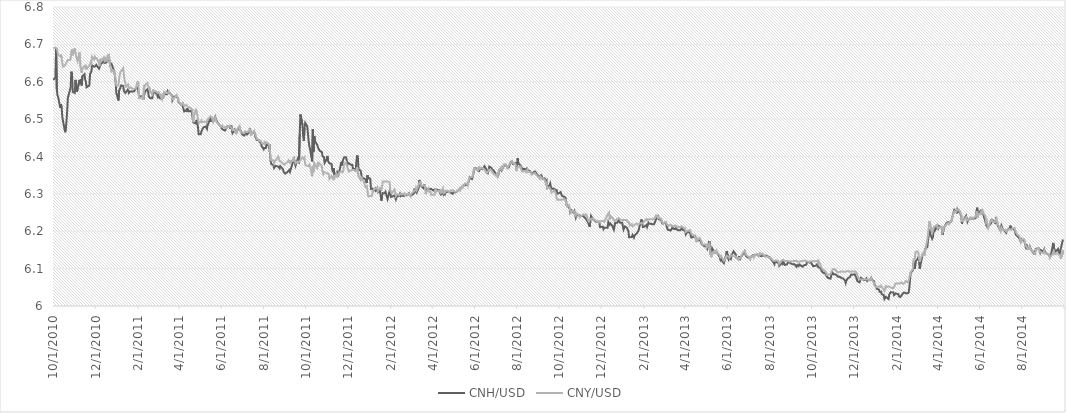
| Category | CNH/USD | CNY/USD |
|---|---|---|
| 10/1/10 | 6.605 | 6.69 |
| 10/4/10 | 6.612 | 6.691 |
| 10/5/10 | 6.691 | 6.691 |
| 10/6/10 | 6.58 | 6.689 |
| 10/7/10 | 6.563 | 6.69 |
| 10/8/10 | 6.559 | 6.671 |
| 10/11/10 | 6.53 | 6.668 |
| 10/12/10 | 6.54 | 6.673 |
| 10/13/10 | 6.53 | 6.663 |
| 10/14/10 | 6.506 | 6.65 |
| 10/15/10 | 6.495 | 6.64 |
| 10/18/10 | 6.465 | 6.644 |
| 10/19/10 | 6.473 | 6.644 |
| 10/20/10 | 6.495 | 6.652 |
| 10/21/10 | 6.522 | 6.65 |
| 10/22/10 | 6.557 | 6.658 |
| 10/25/10 | 6.578 | 6.658 |
| 10/26/10 | 6.585 | 6.662 |
| 10/27/10 | 6.627 | 6.68 |
| 10/28/10 | 6.622 | 6.687 |
| 10/29/10 | 6.573 | 6.671 |
| 11/1/10 | 6.57 | 6.689 |
| 11/2/10 | 6.605 | 6.678 |
| 11/3/10 | 6.584 | 6.676 |
| 11/4/10 | 6.573 | 6.661 |
| 11/5/10 | 6.575 | 6.655 |
| 11/8/10 | 6.605 | 6.679 |
| 11/9/10 | 6.595 | 6.642 |
| 11/10/10 | 6.607 | 6.634 |
| 11/11/10 | 6.59 | 6.624 |
| 11/12/10 | 6.615 | 6.637 |
| 11/15/10 | 6.62 | 6.642 |
| 11/16/10 | 6.605 | 6.638 |
| 11/17/10 | 6.6 | 6.642 |
| 11/18/10 | 6.585 | 6.633 |
| 11/19/10 | 6.585 | 6.64 |
| 11/22/10 | 6.59 | 6.641 |
| 11/23/10 | 6.62 | 6.643 |
| 11/24/10 | 6.62 | 6.653 |
| 11/25/10 | 6.628 | 6.65 |
| 11/26/10 | 6.644 | 6.668 |
| 11/29/10 | 6.64 | 6.66 |
| 11/30/10 | 6.642 | 6.667 |
| 12/1/10 | 6.642 | 6.663 |
| 12/2/10 | 6.645 | 6.661 |
| 12/3/10 | 6.642 | 6.663 |
| 12/6/10 | 6.635 | 6.648 |
| 12/7/10 | 6.635 | 6.646 |
| 12/8/10 | 6.645 | 6.662 |
| 12/9/10 | 6.648 | 6.655 |
| 12/10/10 | 6.647 | 6.655 |
| 12/13/10 | 6.655 | 6.665 |
| 12/14/10 | 6.65 | 6.656 |
| 12/15/10 | 6.652 | 6.654 |
| 12/16/10 | 6.651 | 6.664 |
| 12/17/10 | 6.65 | 6.654 |
| 12/20/10 | 6.661 | 6.674 |
| 12/21/10 | 6.658 | 6.658 |
| 12/22/10 | 6.645 | 6.645 |
| 12/23/10 | 6.645 | 6.645 |
| 12/24/10 | 6.648 | 6.627 |
| 12/27/10 | 6.633 | 6.631 |
| 12/28/10 | 6.628 | 6.625 |
| 12/29/10 | 6.615 | 6.62 |
| 12/30/10 | 6.6 | 6.6 |
| 12/31/10 | 6.57 | 6.59 |
| 1/3/11 | 6.55 | 6.59 |
| 1/4/11 | 6.576 | 6.606 |
| 1/5/11 | 6.58 | 6.619 |
| 1/6/11 | 6.582 | 6.626 |
| 1/7/11 | 6.59 | 6.628 |
| 1/10/11 | 6.588 | 6.636 |
| 1/11/11 | 6.576 | 6.618 |
| 1/12/11 | 6.573 | 6.604 |
| 1/13/11 | 6.57 | 6.604 |
| 1/14/11 | 6.571 | 6.588 |
| 1/17/11 | 6.58 | 6.593 |
| 1/18/11 | 6.57 | 6.583 |
| 1/19/11 | 6.572 | 6.582 |
| 1/20/11 | 6.574 | 6.585 |
| 1/21/11 | 6.572 | 6.583 |
| 1/24/11 | 6.574 | 6.581 |
| 1/25/11 | 6.575 | 6.582 |
| 1/26/11 | 6.575 | 6.581 |
| 1/27/11 | 6.575 | 6.582 |
| 1/28/11 | 6.582 | 6.582 |
| 1/31/11 | 6.584 | 6.602 |
| 2/1/11 | 6.571 | 6.594 |
| 2/2/11 | 6.562 | 6.556 |
| 2/3/11 | 6.562 | 6.556 |
| 2/4/11 | 6.562 | 6.556 |
| 2/7/11 | 6.56 | 6.56 |
| 2/8/11 | 6.552 | 6.552 |
| 2/9/11 | 6.564 | 6.591 |
| 2/10/11 | 6.564 | 6.586 |
| 2/11/11 | 6.575 | 6.592 |
| 2/14/11 | 6.58 | 6.596 |
| 2/15/11 | 6.572 | 6.588 |
| 2/16/11 | 6.56 | 6.588 |
| 2/17/11 | 6.562 | 6.585 |
| 2/18/11 | 6.556 | 6.573 |
| 2/21/11 | 6.556 | 6.567 |
| 2/22/11 | 6.569 | 6.58 |
| 2/23/11 | 6.567 | 6.574 |
| 2/24/11 | 6.573 | 6.572 |
| 2/25/11 | 6.573 | 6.575 |
| 2/28/11 | 6.566 | 6.571 |
| 3/1/11 | 6.56 | 6.57 |
| 3/2/11 | 6.563 | 6.572 |
| 3/3/11 | 6.562 | 6.572 |
| 3/4/11 | 6.556 | 6.567 |
| 3/7/11 | 6.554 | 6.554 |
| 3/8/11 | 6.554 | 6.568 |
| 3/9/11 | 6.559 | 6.558 |
| 3/10/11 | 6.567 | 6.573 |
| 3/11/11 | 6.568 | 6.574 |
| 3/14/11 | 6.566 | 6.57 |
| 3/15/11 | 6.574 | 6.572 |
| 3/16/11 | 6.57 | 6.571 |
| 3/17/11 | 6.571 | 6.574 |
| 3/18/11 | 6.57 | 6.569 |
| 3/21/11 | 6.564 | 6.564 |
| 3/22/11 | 6.551 | 6.551 |
| 3/23/11 | 6.55 | 6.558 |
| 3/24/11 | 6.56 | 6.558 |
| 3/25/11 | 6.558 | 6.557 |
| 3/28/11 | 6.561 | 6.564 |
| 3/29/11 | 6.562 | 6.561 |
| 3/30/11 | 6.556 | 6.556 |
| 3/31/11 | 6.546 | 6.548 |
| 4/1/11 | 6.546 | 6.548 |
| 4/4/11 | 6.538 | 6.538 |
| 4/5/11 | 6.539 | 6.539 |
| 4/6/11 | 6.536 | 6.544 |
| 4/7/11 | 6.536 | 6.542 |
| 4/8/11 | 6.52 | 6.535 |
| 4/11/11 | 6.523 | 6.538 |
| 4/12/11 | 6.529 | 6.54 |
| 4/13/11 | 6.519 | 6.533 |
| 4/14/11 | 6.524 | 6.531 |
| 4/15/11 | 6.521 | 6.532 |
| 4/18/11 | 6.522 | 6.529 |
| 4/19/11 | 6.519 | 6.53 |
| 4/20/11 | 6.507 | 6.525 |
| 4/21/11 | 6.492 | 6.492 |
| 4/22/11 | 6.492 | 6.507 |
| 4/25/11 | 6.488 | 6.528 |
| 4/26/11 | 6.498 | 6.527 |
| 4/27/11 | 6.491 | 6.511 |
| 4/28/11 | 6.478 | 6.501 |
| 4/29/11 | 6.46 | 6.49 |
| 5/2/11 | 6.46 | 6.492 |
| 5/3/11 | 6.467 | 6.496 |
| 5/4/11 | 6.468 | 6.492 |
| 5/5/11 | 6.475 | 6.493 |
| 5/6/11 | 6.478 | 6.492 |
| 5/9/11 | 6.48 | 6.493 |
| 5/10/11 | 6.477 | 6.492 |
| 5/11/11 | 6.474 | 6.492 |
| 5/12/11 | 6.492 | 6.499 |
| 5/13/11 | 6.488 | 6.498 |
| 5/16/11 | 6.504 | 6.508 |
| 5/17/11 | 6.493 | 6.506 |
| 5/18/11 | 6.498 | 6.505 |
| 5/19/11 | 6.496 | 6.504 |
| 5/20/11 | 6.493 | 6.492 |
| 5/23/11 | 6.506 | 6.504 |
| 5/24/11 | 6.499 | 6.498 |
| 5/25/11 | 6.497 | 6.493 |
| 5/26/11 | 6.492 | 6.49 |
| 5/27/11 | 6.489 | 6.492 |
| 5/30/11 | 6.482 | 6.483 |
| 5/31/11 | 6.48 | 6.479 |
| 6/1/11 | 6.476 | 6.478 |
| 6/2/11 | 6.478 | 6.483 |
| 6/3/11 | 6.472 | 6.478 |
| 6/6/11 | 6.47 | 6.478 |
| 6/7/11 | 6.47 | 6.481 |
| 6/8/11 | 6.475 | 6.475 |
| 6/9/11 | 6.48 | 6.476 |
| 6/10/11 | 6.479 | 6.48 |
| 6/13/11 | 6.482 | 6.483 |
| 6/14/11 | 6.474 | 6.479 |
| 6/15/11 | 6.482 | 6.481 |
| 6/16/11 | 6.481 | 6.475 |
| 6/17/11 | 6.463 | 6.47 |
| 6/20/11 | 6.472 | 6.472 |
| 6/21/11 | 6.468 | 6.465 |
| 6/22/11 | 6.461 | 6.462 |
| 6/23/11 | 6.468 | 6.468 |
| 6/24/11 | 6.471 | 6.474 |
| 6/27/11 | 6.478 | 6.482 |
| 6/28/11 | 6.475 | 6.469 |
| 6/29/11 | 6.467 | 6.463 |
| 6/30/11 | 6.462 | 6.464 |
| 7/1/11 | 6.459 | 6.464 |
| 7/4/11 | 6.456 | 6.463 |
| 7/5/11 | 6.46 | 6.467 |
| 7/6/11 | 6.464 | 6.467 |
| 7/7/11 | 6.464 | 6.466 |
| 7/8/11 | 6.459 | 6.464 |
| 7/11/11 | 6.465 | 6.467 |
| 7/12/11 | 6.475 | 6.472 |
| 7/13/11 | 6.464 | 6.468 |
| 7/14/11 | 6.46 | 6.459 |
| 7/15/11 | 6.46 | 6.461 |
| 7/18/11 | 6.467 | 6.469 |
| 7/19/11 | 6.462 | 6.463 |
| 7/20/11 | 6.453 | 6.458 |
| 7/21/11 | 6.454 | 6.454 |
| 7/22/11 | 6.444 | 6.447 |
| 7/25/11 | 6.444 | 6.444 |
| 7/26/11 | 6.438 | 6.441 |
| 7/27/11 | 6.437 | 6.443 |
| 7/28/11 | 6.436 | 6.442 |
| 7/29/11 | 6.428 | 6.436 |
| 8/1/11 | 6.419 | 6.434 |
| 8/2/11 | 6.423 | 6.438 |
| 8/3/11 | 6.422 | 6.434 |
| 8/4/11 | 6.423 | 6.438 |
| 8/5/11 | 6.435 | 6.44 |
| 8/8/11 | 6.428 | 6.434 |
| 8/9/11 | 6.433 | 6.43 |
| 8/10/11 | 6.41 | 6.417 |
| 8/11/11 | 6.388 | 6.394 |
| 8/12/11 | 6.38 | 6.389 |
| 8/15/11 | 6.377 | 6.39 |
| 8/16/11 | 6.37 | 6.382 |
| 8/17/11 | 6.368 | 6.387 |
| 8/18/11 | 6.375 | 6.388 |
| 8/19/11 | 6.375 | 6.391 |
| 8/22/11 | 6.373 | 6.4 |
| 8/23/11 | 6.372 | 6.398 |
| 8/24/11 | 6.368 | 6.388 |
| 8/25/11 | 6.374 | 6.39 |
| 8/26/11 | 6.372 | 6.387 |
| 8/29/11 | 6.366 | 6.381 |
| 8/30/11 | 6.358 | 6.38 |
| 8/31/11 | 6.356 | 6.378 |
| 9/1/11 | 6.354 | 6.381 |
| 9/2/11 | 6.354 | 6.382 |
| 9/5/11 | 6.36 | 6.386 |
| 9/6/11 | 6.36 | 6.39 |
| 9/7/11 | 6.364 | 6.392 |
| 9/8/11 | 6.359 | 6.383 |
| 9/9/11 | 6.361 | 6.388 |
| 9/12/11 | 6.384 | 6.388 |
| 9/13/11 | 6.385 | 6.398 |
| 9/14/11 | 6.393 | 6.391 |
| 9/15/11 | 6.383 | 6.388 |
| 9/16/11 | 6.376 | 6.382 |
| 9/19/11 | 6.392 | 6.386 |
| 9/20/11 | 6.386 | 6.384 |
| 9/21/11 | 6.381 | 6.381 |
| 9/22/11 | 6.46 | 6.388 |
| 9/23/11 | 6.512 | 6.387 |
| 9/26/11 | 6.485 | 6.398 |
| 9/27/11 | 6.455 | 6.398 |
| 9/28/11 | 6.442 | 6.393 |
| 9/29/11 | 6.478 | 6.396 |
| 9/30/11 | 6.49 | 6.378 |
| 10/3/11 | 6.48 | 6.374 |
| 10/4/11 | 6.48 | 6.374 |
| 10/5/11 | 6.44 | 6.374 |
| 10/6/11 | 6.427 | 6.378 |
| 10/7/11 | 6.42 | 6.374 |
| 10/10/11 | 6.387 | 6.347 |
| 10/11/11 | 6.473 | 6.374 |
| 10/12/11 | 6.413 | 6.358 |
| 10/13/11 | 6.455 | 6.382 |
| 10/14/11 | 6.442 | 6.378 |
| 10/17/11 | 6.432 | 6.369 |
| 10/18/11 | 6.43 | 6.38 |
| 10/19/11 | 6.422 | 6.377 |
| 10/20/11 | 6.42 | 6.382 |
| 10/21/11 | 6.415 | 6.382 |
| 10/24/11 | 6.412 | 6.374 |
| 10/25/11 | 6.401 | 6.36 |
| 10/26/11 | 6.402 | 6.353 |
| 10/27/11 | 6.398 | 6.359 |
| 10/28/11 | 6.383 | 6.357 |
| 10/31/11 | 6.393 | 6.355 |
| 11/1/11 | 6.402 | 6.354 |
| 11/2/11 | 6.388 | 6.355 |
| 11/3/11 | 6.39 | 6.351 |
| 11/4/11 | 6.382 | 6.34 |
| 11/7/11 | 6.38 | 6.348 |
| 11/8/11 | 6.366 | 6.346 |
| 11/9/11 | 6.358 | 6.34 |
| 11/10/11 | 6.369 | 6.345 |
| 11/11/11 | 6.352 | 6.342 |
| 11/14/11 | 6.356 | 6.354 |
| 11/15/11 | 6.359 | 6.346 |
| 11/16/11 | 6.358 | 6.344 |
| 11/17/11 | 6.351 | 6.35 |
| 11/18/11 | 6.357 | 6.356 |
| 11/21/11 | 6.385 | 6.36 |
| 11/22/11 | 6.376 | 6.36 |
| 11/23/11 | 6.387 | 6.358 |
| 11/24/11 | 6.388 | 6.362 |
| 11/25/11 | 6.398 | 6.38 |
| 11/28/11 | 6.398 | 6.384 |
| 11/29/11 | 6.39 | 6.377 |
| 11/30/11 | 6.379 | 6.378 |
| 12/1/11 | 6.383 | 6.366 |
| 12/2/11 | 6.384 | 6.36 |
| 12/5/11 | 6.378 | 6.363 |
| 12/6/11 | 6.38 | 6.364 |
| 12/7/11 | 6.378 | 6.364 |
| 12/8/11 | 6.368 | 6.362 |
| 12/9/11 | 6.368 | 6.364 |
| 12/12/11 | 6.366 | 6.36 |
| 12/13/11 | 6.388 | 6.365 |
| 12/14/11 | 6.403 | 6.371 |
| 12/15/11 | 6.398 | 6.373 |
| 12/16/11 | 6.366 | 6.348 |
| 12/19/11 | 6.362 | 6.338 |
| 12/20/11 | 6.353 | 6.346 |
| 12/21/11 | 6.342 | 6.339 |
| 12/22/11 | 6.345 | 6.339 |
| 12/23/11 | 6.342 | 6.336 |
| 12/26/11 | 6.339 | 6.319 |
| 12/27/11 | 6.334 | 6.321 |
| 12/28/11 | 6.329 | 6.321 |
| 12/29/11 | 6.35 | 6.319 |
| 12/30/11 | 6.343 | 6.294 |
| 1/2/12 | 6.341 | 6.294 |
| 1/3/12 | 6.314 | 6.294 |
| 1/4/12 | 6.313 | 6.294 |
| 1/5/12 | 6.314 | 6.301 |
| 1/6/12 | 6.307 | 6.309 |
| 1/9/12 | 6.314 | 6.314 |
| 1/10/12 | 6.308 | 6.314 |
| 1/11/12 | 6.31 | 6.315 |
| 1/12/12 | 6.312 | 6.318 |
| 1/13/12 | 6.304 | 6.306 |
| 1/16/12 | 6.308 | 6.316 |
| 1/17/12 | 6.296 | 6.314 |
| 1/18/12 | 6.282 | 6.311 |
| 1/19/12 | 6.295 | 6.316 |
| 1/20/12 | 6.302 | 6.333 |
| 1/23/12 | 6.302 | 6.333 |
| 1/24/12 | 6.306 | 6.333 |
| 1/25/12 | 6.305 | 6.333 |
| 1/26/12 | 6.292 | 6.333 |
| 1/27/12 | 6.286 | 6.333 |
| 1/30/12 | 6.308 | 6.331 |
| 1/31/12 | 6.302 | 6.308 |
| 2/1/12 | 6.292 | 6.306 |
| 2/2/12 | 6.294 | 6.302 |
| 2/3/12 | 6.293 | 6.303 |
| 2/6/12 | 6.296 | 6.312 |
| 2/7/12 | 6.292 | 6.305 |
| 2/8/12 | 6.286 | 6.294 |
| 2/9/12 | 6.291 | 6.295 |
| 2/10/12 | 6.294 | 6.299 |
| 2/13/12 | 6.295 | 6.297 |
| 2/14/12 | 6.3 | 6.3 |
| 2/15/12 | 6.295 | 6.3 |
| 2/16/12 | 6.298 | 6.301 |
| 2/17/12 | 6.295 | 6.298 |
| 2/20/12 | 6.294 | 6.301 |
| 2/21/12 | 6.298 | 6.296 |
| 2/22/12 | 6.297 | 6.296 |
| 2/23/12 | 6.296 | 6.298 |
| 2/24/12 | 6.296 | 6.298 |
| 2/27/12 | 6.302 | 6.301 |
| 2/28/12 | 6.296 | 6.299 |
| 2/29/12 | 6.295 | 6.294 |
| 3/1/12 | 6.296 | 6.3 |
| 3/2/12 | 6.296 | 6.298 |
| 3/5/12 | 6.301 | 6.307 |
| 3/6/12 | 6.314 | 6.308 |
| 3/7/12 | 6.308 | 6.31 |
| 3/8/12 | 6.307 | 6.316 |
| 3/9/12 | 6.303 | 6.31 |
| 3/12/12 | 6.316 | 6.326 |
| 3/13/12 | 6.337 | 6.327 |
| 3/14/12 | 6.332 | 6.331 |
| 3/15/12 | 6.327 | 6.328 |
| 3/16/12 | 6.32 | 6.322 |
| 3/19/12 | 6.315 | 6.322 |
| 3/20/12 | 6.325 | 6.324 |
| 3/21/12 | 6.324 | 6.323 |
| 3/22/12 | 6.314 | 6.299 |
| 3/23/12 | 6.31 | 6.304 |
| 3/26/12 | 6.312 | 6.314 |
| 3/27/12 | 6.312 | 6.306 |
| 3/28/12 | 6.313 | 6.304 |
| 3/29/12 | 6.315 | 6.306 |
| 3/30/12 | 6.314 | 6.298 |
| 4/2/12 | 6.309 | 6.298 |
| 4/3/12 | 6.31 | 6.298 |
| 4/4/12 | 6.312 | 6.298 |
| 4/5/12 | 6.314 | 6.312 |
| 4/6/12 | 6.312 | 6.305 |
| 4/9/12 | 6.31 | 6.308 |
| 4/10/12 | 6.309 | 6.31 |
| 4/11/12 | 6.31 | 6.308 |
| 4/12/12 | 6.302 | 6.307 |
| 4/13/12 | 6.298 | 6.302 |
| 4/16/12 | 6.301 | 6.315 |
| 4/17/12 | 6.298 | 6.302 |
| 4/18/12 | 6.304 | 6.303 |
| 4/19/12 | 6.3 | 6.304 |
| 4/20/12 | 6.305 | 6.308 |
| 4/23/12 | 6.306 | 6.308 |
| 4/24/12 | 6.306 | 6.307 |
| 4/25/12 | 6.306 | 6.304 |
| 4/26/12 | 6.303 | 6.305 |
| 4/27/12 | 6.304 | 6.309 |
| 4/30/12 | 6.3 | 6.309 |
| 5/1/12 | 6.298 | 6.309 |
| 5/2/12 | 6.305 | 6.307 |
| 5/3/12 | 6.304 | 6.305 |
| 5/4/12 | 6.304 | 6.306 |
| 5/7/12 | 6.308 | 6.307 |
| 5/8/12 | 6.306 | 6.308 |
| 5/9/12 | 6.311 | 6.31 |
| 5/10/12 | 6.312 | 6.314 |
| 5/11/12 | 6.313 | 6.31 |
| 5/14/12 | 6.32 | 6.321 |
| 5/15/12 | 6.318 | 6.318 |
| 5/16/12 | 6.323 | 6.321 |
| 5/17/12 | 6.325 | 6.325 |
| 5/18/12 | 6.323 | 6.328 |
| 5/21/12 | 6.324 | 6.327 |
| 5/22/12 | 6.322 | 6.323 |
| 5/23/12 | 6.332 | 6.334 |
| 5/24/12 | 6.338 | 6.344 |
| 5/25/12 | 6.344 | 6.344 |
| 5/28/12 | 6.34 | 6.345 |
| 5/29/12 | 6.345 | 6.348 |
| 5/30/12 | 6.354 | 6.357 |
| 5/31/12 | 6.366 | 6.368 |
| 6/1/12 | 6.368 | 6.369 |
| 6/4/12 | 6.368 | 6.364 |
| 6/5/12 | 6.366 | 6.367 |
| 6/6/12 | 6.364 | 6.364 |
| 6/7/12 | 6.358 | 6.363 |
| 6/8/12 | 6.37 | 6.37 |
| 6/11/12 | 6.367 | 6.369 |
| 6/12/12 | 6.37 | 6.37 |
| 6/13/12 | 6.368 | 6.368 |
| 6/14/12 | 6.368 | 6.37 |
| 6/15/12 | 6.374 | 6.365 |
| 6/18/12 | 6.365 | 6.357 |
| 6/19/12 | 6.36 | 6.354 |
| 6/20/12 | 6.357 | 6.36 |
| 6/21/12 | 6.364 | 6.364 |
| 6/22/12 | 6.373 | 6.364 |
| 6/25/12 | 6.37 | 6.363 |
| 6/26/12 | 6.365 | 6.363 |
| 6/27/12 | 6.363 | 6.356 |
| 6/28/12 | 6.364 | 6.357 |
| 6/29/12 | 6.365 | 6.353 |
| 7/2/12 | 6.351 | 6.348 |
| 7/3/12 | 6.35 | 6.352 |
| 7/4/12 | 6.346 | 6.348 |
| 7/5/12 | 6.35 | 6.356 |
| 7/6/12 | 6.36 | 6.364 |
| 7/9/12 | 6.369 | 6.371 |
| 7/10/12 | 6.363 | 6.365 |
| 7/11/12 | 6.364 | 6.368 |
| 7/12/12 | 6.371 | 6.373 |
| 7/13/12 | 6.376 | 6.379 |
| 7/16/12 | 6.378 | 6.378 |
| 7/17/12 | 6.374 | 6.372 |
| 7/18/12 | 6.37 | 6.369 |
| 7/19/12 | 6.369 | 6.372 |
| 7/20/12 | 6.37 | 6.373 |
| 7/23/12 | 6.386 | 6.386 |
| 7/24/12 | 6.387 | 6.386 |
| 7/25/12 | 6.387 | 6.388 |
| 7/26/12 | 6.38 | 6.384 |
| 7/27/12 | 6.382 | 6.381 |
| 7/30/12 | 6.382 | 6.379 |
| 7/31/12 | 6.372 | 6.361 |
| 8/1/12 | 6.377 | 6.368 |
| 8/2/12 | 6.396 | 6.367 |
| 8/3/12 | 6.381 | 6.372 |
| 8/6/12 | 6.376 | 6.374 |
| 8/7/12 | 6.376 | 6.366 |
| 8/8/12 | 6.369 | 6.361 |
| 8/9/12 | 6.364 | 6.359 |
| 8/10/12 | 6.367 | 6.36 |
| 8/13/12 | 6.366 | 6.361 |
| 8/14/12 | 6.363 | 6.359 |
| 8/15/12 | 6.367 | 6.362 |
| 8/16/12 | 6.369 | 6.366 |
| 8/17/12 | 6.362 | 6.358 |
| 8/20/12 | 6.361 | 6.359 |
| 8/21/12 | 6.356 | 6.356 |
| 8/22/12 | 6.356 | 6.352 |
| 8/23/12 | 6.354 | 6.354 |
| 8/24/12 | 6.356 | 6.354 |
| 8/27/12 | 6.36 | 6.356 |
| 8/28/12 | 6.358 | 6.352 |
| 8/29/12 | 6.355 | 6.351 |
| 8/30/12 | 6.354 | 6.349 |
| 8/31/12 | 6.35 | 6.348 |
| 9/3/12 | 6.346 | 6.34 |
| 9/4/12 | 6.346 | 6.346 |
| 9/5/12 | 6.35 | 6.349 |
| 9/6/12 | 6.347 | 6.343 |
| 9/7/12 | 6.34 | 6.343 |
| 9/10/12 | 6.342 | 6.338 |
| 9/11/12 | 6.337 | 6.335 |
| 9/12/12 | 6.33 | 6.326 |
| 9/13/12 | 6.334 | 6.329 |
| 9/14/12 | 6.316 | 6.314 |
| 9/17/12 | 6.323 | 6.317 |
| 9/18/12 | 6.328 | 6.319 |
| 9/19/12 | 6.318 | 6.309 |
| 9/20/12 | 6.314 | 6.304 |
| 9/21/12 | 6.312 | 6.305 |
| 9/24/12 | 6.314 | 6.309 |
| 9/25/12 | 6.311 | 6.306 |
| 9/26/12 | 6.304 | 6.302 |
| 9/27/12 | 6.312 | 6.302 |
| 9/28/12 | 6.3 | 6.284 |
| 10/1/12 | 6.302 | 6.284 |
| 10/2/12 | 6.301 | 6.284 |
| 10/3/12 | 6.305 | 6.284 |
| 10/4/12 | 6.303 | 6.284 |
| 10/5/12 | 6.294 | 6.284 |
| 10/8/12 | 6.292 | 6.287 |
| 10/9/12 | 6.292 | 6.288 |
| 10/10/12 | 6.29 | 6.283 |
| 10/11/12 | 6.28 | 6.276 |
| 10/12/12 | 6.268 | 6.267 |
| 10/15/12 | 6.265 | 6.27 |
| 10/16/12 | 6.261 | 6.264 |
| 10/17/12 | 6.25 | 6.254 |
| 10/18/12 | 6.252 | 6.25 |
| 10/19/12 | 6.255 | 6.253 |
| 10/22/12 | 6.249 | 6.254 |
| 10/23/12 | 6.254 | 6.248 |
| 10/24/12 | 6.244 | 6.248 |
| 10/25/12 | 6.236 | 6.242 |
| 10/26/12 | 6.242 | 6.248 |
| 10/29/12 | 6.244 | 6.244 |
| 10/30/12 | 6.242 | 6.24 |
| 10/31/12 | 6.24 | 6.237 |
| 11/1/12 | 6.241 | 6.239 |
| 11/2/12 | 6.24 | 6.241 |
| 11/5/12 | 6.241 | 6.245 |
| 11/6/12 | 6.238 | 6.245 |
| 11/7/12 | 6.236 | 6.244 |
| 11/8/12 | 6.235 | 6.243 |
| 11/9/12 | 6.232 | 6.245 |
| 11/12/12 | 6.223 | 6.229 |
| 11/13/12 | 6.217 | 6.226 |
| 11/14/12 | 6.212 | 6.225 |
| 11/15/12 | 6.228 | 6.233 |
| 11/16/12 | 6.241 | 6.235 |
| 11/19/12 | 6.232 | 6.234 |
| 11/20/12 | 6.234 | 6.232 |
| 11/21/12 | 6.23 | 6.23 |
| 11/22/12 | 6.229 | 6.229 |
| 11/23/12 | 6.226 | 6.228 |
| 11/26/12 | 6.225 | 6.225 |
| 11/27/12 | 6.224 | 6.222 |
| 11/28/12 | 6.224 | 6.227 |
| 11/29/12 | 6.211 | 6.228 |
| 11/30/12 | 6.213 | 6.226 |
| 12/3/12 | 6.212 | 6.228 |
| 12/4/12 | 6.206 | 6.225 |
| 12/5/12 | 6.209 | 6.225 |
| 12/6/12 | 6.212 | 6.228 |
| 12/7/12 | 6.21 | 6.23 |
| 12/10/12 | 6.21 | 6.245 |
| 12/11/12 | 6.225 | 6.246 |
| 12/12/12 | 6.224 | 6.25 |
| 12/13/12 | 6.218 | 6.232 |
| 12/14/12 | 6.22 | 6.241 |
| 12/17/12 | 6.214 | 6.236 |
| 12/18/12 | 6.208 | 6.232 |
| 12/19/12 | 6.204 | 6.229 |
| 12/20/12 | 6.214 | 6.23 |
| 12/21/12 | 6.223 | 6.228 |
| 12/24/12 | 6.223 | 6.234 |
| 12/25/12 | 6.224 | 6.234 |
| 12/26/12 | 6.23 | 6.235 |
| 12/27/12 | 6.227 | 6.236 |
| 12/28/12 | 6.223 | 6.231 |
| 12/31/12 | 6.223 | 6.23 |
| 1/1/13 | 6.223 | 6.23 |
| 1/2/13 | 6.204 | 6.23 |
| 1/3/13 | 6.209 | 6.23 |
| 1/4/13 | 6.213 | 6.23 |
| 1/7/13 | 6.209 | 6.229 |
| 1/8/13 | 6.204 | 6.224 |
| 1/9/13 | 6.2 | 6.226 |
| 1/10/13 | 6.184 | 6.223 |
| 1/11/13 | 6.183 | 6.216 |
| 1/14/13 | 6.184 | 6.219 |
| 1/15/13 | 6.19 | 6.213 |
| 1/16/13 | 6.188 | 6.216 |
| 1/17/13 | 6.183 | 6.216 |
| 1/18/13 | 6.189 | 6.215 |
| 1/21/13 | 6.194 | 6.221 |
| 1/22/13 | 6.197 | 6.22 |
| 1/23/13 | 6.2 | 6.218 |
| 1/24/13 | 6.203 | 6.218 |
| 1/25/13 | 6.213 | 6.22 |
| 1/28/13 | 6.232 | 6.222 |
| 1/29/13 | 6.22 | 6.224 |
| 1/30/13 | 6.212 | 6.22 |
| 1/31/13 | 6.209 | 6.219 |
| 2/1/13 | 6.212 | 6.227 |
| 2/4/13 | 6.216 | 6.233 |
| 2/5/13 | 6.211 | 6.229 |
| 2/6/13 | 6.214 | 6.232 |
| 2/7/13 | 6.223 | 6.232 |
| 2/8/13 | 6.22 | 6.232 |
| 2/11/13 | 6.22 | 6.232 |
| 2/12/13 | 6.221 | 6.232 |
| 2/13/13 | 6.218 | 6.232 |
| 2/14/13 | 6.219 | 6.232 |
| 2/15/13 | 6.218 | 6.232 |
| 2/18/13 | 6.232 | 6.242 |
| 2/19/13 | 6.236 | 6.244 |
| 2/20/13 | 6.234 | 6.237 |
| 2/21/13 | 6.241 | 6.24 |
| 2/22/13 | 6.232 | 6.235 |
| 2/25/13 | 6.23 | 6.234 |
| 2/26/13 | 6.227 | 6.229 |
| 2/27/13 | 6.221 | 6.227 |
| 2/28/13 | 6.219 | 6.221 |
| 3/1/13 | 6.221 | 6.223 |
| 3/4/13 | 6.224 | 6.225 |
| 3/5/13 | 6.216 | 6.221 |
| 3/6/13 | 6.208 | 6.218 |
| 3/7/13 | 6.204 | 6.22 |
| 3/8/13 | 6.202 | 6.214 |
| 3/11/13 | 6.202 | 6.218 |
| 3/12/13 | 6.205 | 6.216 |
| 3/13/13 | 6.207 | 6.214 |
| 3/14/13 | 6.212 | 6.214 |
| 3/15/13 | 6.206 | 6.213 |
| 3/18/13 | 6.206 | 6.216 |
| 3/19/13 | 6.209 | 6.215 |
| 3/20/13 | 6.205 | 6.212 |
| 3/21/13 | 6.204 | 6.214 |
| 3/22/13 | 6.202 | 6.212 |
| 3/25/13 | 6.203 | 6.21 |
| 3/26/13 | 6.204 | 6.211 |
| 3/27/13 | 6.209 | 6.214 |
| 3/28/13 | 6.206 | 6.214 |
| 3/29/13 | 6.203 | 6.211 |
| 4/1/13 | 6.202 | 6.208 |
| 4/2/13 | 6.192 | 6.198 |
| 4/3/13 | 6.193 | 6.201 |
| 4/4/13 | 6.198 | 6.201 |
| 4/5/13 | 6.198 | 6.201 |
| 4/8/13 | 6.196 | 6.203 |
| 4/9/13 | 6.189 | 6.202 |
| 4/10/13 | 6.184 | 6.194 |
| 4/11/13 | 6.182 | 6.196 |
| 4/12/13 | 6.184 | 6.191 |
| 4/15/13 | 6.188 | 6.187 |
| 4/16/13 | 6.184 | 6.182 |
| 4/17/13 | 6.18 | 6.172 |
| 4/18/13 | 6.174 | 6.181 |
| 4/19/13 | 6.173 | 6.177 |
| 4/22/13 | 6.178 | 6.182 |
| 4/23/13 | 6.178 | 6.179 |
| 4/24/13 | 6.17 | 6.178 |
| 4/25/13 | 6.166 | 6.171 |
| 4/26/13 | 6.165 | 6.165 |
| 4/29/13 | 6.16 | 6.165 |
| 4/30/13 | 6.162 | 6.165 |
| 5/1/13 | 6.16 | 6.165 |
| 5/2/13 | 6.158 | 6.156 |
| 5/3/13 | 6.153 | 6.156 |
| 5/6/13 | 6.174 | 6.166 |
| 5/7/13 | 6.155 | 6.154 |
| 5/8/13 | 6.136 | 6.141 |
| 5/9/13 | 6.134 | 6.131 |
| 5/10/13 | 6.154 | 6.142 |
| 5/13/13 | 6.143 | 6.146 |
| 5/14/13 | 6.141 | 6.143 |
| 5/15/13 | 6.143 | 6.145 |
| 5/16/13 | 6.143 | 6.149 |
| 5/17/13 | 6.144 | 6.141 |
| 5/20/13 | 6.134 | 6.139 |
| 5/21/13 | 6.131 | 6.135 |
| 5/22/13 | 6.124 | 6.131 |
| 5/23/13 | 6.128 | 6.134 |
| 5/24/13 | 6.122 | 6.131 |
| 5/27/13 | 6.115 | 6.121 |
| 5/28/13 | 6.117 | 6.121 |
| 5/29/13 | 6.128 | 6.126 |
| 5/30/13 | 6.135 | 6.131 |
| 5/31/13 | 6.147 | 6.134 |
| 6/3/13 | 6.124 | 6.131 |
| 6/4/13 | 6.128 | 6.128 |
| 6/5/13 | 6.128 | 6.128 |
| 6/6/13 | 6.125 | 6.136 |
| 6/7/13 | 6.136 | 6.133 |
| 6/10/13 | 6.146 | 6.133 |
| 6/11/13 | 6.145 | 6.133 |
| 6/12/13 | 6.141 | 6.133 |
| 6/13/13 | 6.138 | 6.134 |
| 6/14/13 | 6.129 | 6.131 |
| 6/17/13 | 6.126 | 6.125 |
| 6/18/13 | 6.133 | 6.128 |
| 6/19/13 | 6.123 | 6.126 |
| 6/20/13 | 6.129 | 6.128 |
| 6/21/13 | 6.129 | 6.133 |
| 6/24/13 | 6.139 | 6.144 |
| 6/25/13 | 6.14 | 6.145 |
| 6/26/13 | 6.146 | 6.147 |
| 6/27/13 | 6.144 | 6.149 |
| 6/28/13 | 6.133 | 6.137 |
| 7/1/13 | 6.13 | 6.132 |
| 7/2/13 | 6.129 | 6.133 |
| 7/3/13 | 6.13 | 6.131 |
| 7/4/13 | 6.128 | 6.126 |
| 7/5/13 | 6.131 | 6.132 |
| 7/8/13 | 6.136 | 6.134 |
| 7/9/13 | 6.136 | 6.129 |
| 7/10/13 | 6.134 | 6.134 |
| 7/11/13 | 6.133 | 6.135 |
| 7/12/13 | 6.137 | 6.137 |
| 7/15/13 | 6.138 | 6.137 |
| 7/16/13 | 6.135 | 6.134 |
| 7/17/13 | 6.135 | 6.135 |
| 7/18/13 | 6.139 | 6.141 |
| 7/19/13 | 6.134 | 6.138 |
| 7/22/13 | 6.134 | 6.14 |
| 7/23/13 | 6.133 | 6.137 |
| 7/24/13 | 6.134 | 6.136 |
| 7/25/13 | 6.136 | 6.134 |
| 7/26/13 | 6.135 | 6.132 |
| 7/29/13 | 6.133 | 6.132 |
| 7/30/13 | 6.134 | 6.132 |
| 7/31/13 | 6.131 | 6.128 |
| 8/1/13 | 6.133 | 6.13 |
| 8/2/13 | 6.129 | 6.129 |
| 8/5/13 | 6.121 | 6.124 |
| 8/6/13 | 6.118 | 6.122 |
| 8/7/13 | 6.117 | 6.119 |
| 8/8/13 | 6.112 | 6.121 |
| 8/9/13 | 6.119 | 6.122 |
| 8/12/13 | 6.117 | 6.122 |
| 8/13/13 | 6.118 | 6.122 |
| 8/14/13 | 6.115 | 6.119 |
| 8/15/13 | 6.107 | 6.112 |
| 8/16/13 | 6.109 | 6.114 |
| 8/19/13 | 6.116 | 6.123 |
| 8/20/13 | 6.113 | 6.124 |
| 8/21/13 | 6.118 | 6.123 |
| 8/22/13 | 6.114 | 6.121 |
| 8/23/13 | 6.11 | 6.12 |
| 8/26/13 | 6.111 | 6.12 |
| 8/27/13 | 6.115 | 6.121 |
| 8/28/13 | 6.116 | 6.12 |
| 8/29/13 | 6.117 | 6.12 |
| 8/30/13 | 6.115 | 6.119 |
| 9/2/13 | 6.113 | 6.119 |
| 9/3/13 | 6.114 | 6.12 |
| 9/4/13 | 6.111 | 6.12 |
| 9/5/13 | 6.114 | 6.119 |
| 9/6/13 | 6.112 | 6.12 |
| 9/9/13 | 6.105 | 6.121 |
| 9/10/13 | 6.109 | 6.12 |
| 9/11/13 | 6.107 | 6.118 |
| 9/12/13 | 6.107 | 6.118 |
| 9/13/13 | 6.111 | 6.119 |
| 9/16/13 | 6.107 | 6.12 |
| 9/17/13 | 6.107 | 6.121 |
| 9/18/13 | 6.105 | 6.121 |
| 9/19/13 | 6.108 | 6.121 |
| 9/20/13 | 6.11 | 6.121 |
| 9/23/13 | 6.11 | 6.121 |
| 9/24/13 | 6.116 | 6.121 |
| 9/25/13 | 6.116 | 6.119 |
| 9/26/13 | 6.117 | 6.119 |
| 9/27/13 | 6.115 | 6.118 |
| 9/30/13 | 6.116 | 6.12 |
| 10/1/13 | 6.113 | 6.12 |
| 10/2/13 | 6.11 | 6.12 |
| 10/3/13 | 6.106 | 6.12 |
| 10/4/13 | 6.106 | 6.12 |
| 10/7/13 | 6.108 | 6.12 |
| 10/8/13 | 6.11 | 6.121 |
| 10/9/13 | 6.112 | 6.121 |
| 10/10/13 | 6.105 | 6.116 |
| 10/11/13 | 6.105 | 6.12 |
| 10/14/13 | 6.1 | 6.107 |
| 10/15/13 | 6.095 | 6.103 |
| 10/16/13 | 6.095 | 6.1 |
| 10/17/13 | 6.09 | 6.098 |
| 10/18/13 | 6.089 | 6.097 |
| 10/21/13 | 6.087 | 6.092 |
| 10/22/13 | 6.082 | 6.092 |
| 10/23/13 | 6.084 | 6.083 |
| 10/24/13 | 6.076 | 6.082 |
| 10/25/13 | 6.073 | 6.084 |
| 10/28/13 | 6.073 | 6.085 |
| 10/29/13 | 6.08 | 6.09 |
| 10/30/13 | 6.082 | 6.094 |
| 10/31/13 | 6.09 | 6.094 |
| 11/1/13 | 6.085 | 6.099 |
| 11/4/13 | 6.085 | 6.098 |
| 11/5/13 | 6.086 | 6.097 |
| 11/6/13 | 6.082 | 6.092 |
| 11/7/13 | 6.084 | 6.091 |
| 11/8/13 | 6.078 | 6.09 |
| 11/11/13 | 6.078 | 6.091 |
| 11/12/13 | 6.076 | 6.092 |
| 11/13/13 | 6.075 | 6.093 |
| 11/14/13 | 6.076 | 6.092 |
| 11/15/13 | 6.074 | 6.092 |
| 11/18/13 | 6.068 | 6.092 |
| 11/19/13 | 6.062 | 6.092 |
| 11/20/13 | 6.068 | 6.092 |
| 11/21/13 | 6.069 | 6.093 |
| 11/22/13 | 6.074 | 6.094 |
| 11/25/13 | 6.077 | 6.092 |
| 11/26/13 | 6.08 | 6.092 |
| 11/27/13 | 6.084 | 6.092 |
| 11/28/13 | 6.086 | 6.092 |
| 11/29/13 | 6.084 | 6.092 |
| 12/2/13 | 6.085 | 6.093 |
| 12/3/13 | 6.083 | 6.091 |
| 12/4/13 | 6.078 | 6.091 |
| 12/5/13 | 6.077 | 6.09 |
| 12/6/13 | 6.066 | 6.082 |
| 12/9/13 | 6.063 | 6.071 |
| 12/10/13 | 6.064 | 6.07 |
| 12/11/13 | 6.075 | 6.071 |
| 12/12/13 | 6.074 | 6.071 |
| 12/13/13 | 6.072 | 6.071 |
| 12/16/13 | 6.07 | 6.071 |
| 12/17/13 | 6.069 | 6.071 |
| 12/18/13 | 6.07 | 6.071 |
| 12/19/13 | 6.073 | 6.071 |
| 12/20/13 | 6.067 | 6.071 |
| 12/23/13 | 6.07 | 6.07 |
| 12/24/13 | 6.072 | 6.071 |
| 12/25/13 | 6.07 | 6.071 |
| 12/26/13 | 6.075 | 6.074 |
| 12/27/13 | 6.07 | 6.068 |
| 12/30/13 | 6.066 | 6.062 |
| 12/31/13 | 6.056 | 6.054 |
| 1/1/14 | 6.056 | 6.054 |
| 1/2/14 | 6.051 | 6.05 |
| 1/3/14 | 6.046 | 6.05 |
| 1/6/14 | 6.044 | 6.052 |
| 1/7/14 | 6.038 | 6.051 |
| 1/8/14 | 6.038 | 6.051 |
| 1/9/14 | 6.038 | 6.054 |
| 1/10/14 | 6.032 | 6.052 |
| 1/13/14 | 6.029 | 6.043 |
| 1/14/14 | 6.018 | 6.04 |
| 1/15/14 | 6.021 | 6.046 |
| 1/16/14 | 6.024 | 6.056 |
| 1/17/14 | 6.022 | 6.05 |
| 1/20/14 | 6.019 | 6.052 |
| 1/21/14 | 6.031 | 6.05 |
| 1/22/14 | 6.028 | 6.051 |
| 1/23/14 | 6.037 | 6.052 |
| 1/24/14 | 6.039 | 6.049 |
| 1/27/14 | 6.036 | 6.048 |
| 1/28/14 | 6.029 | 6.051 |
| 1/29/14 | 6.029 | 6.055 |
| 1/30/14 | 6.034 | 6.06 |
| 1/31/14 | 6.034 | 6.06 |
| 2/3/14 | 6.032 | 6.06 |
| 2/4/14 | 6.026 | 6.06 |
| 2/5/14 | 6.027 | 6.06 |
| 2/6/14 | 6.024 | 6.06 |
| 2/7/14 | 6.026 | 6.063 |
| 2/10/14 | 6.034 | 6.059 |
| 2/11/14 | 6.035 | 6.06 |
| 2/12/14 | 6.036 | 6.061 |
| 2/13/14 | 6.038 | 6.063 |
| 2/14/14 | 6.034 | 6.067 |
| 2/17/14 | 6.034 | 6.064 |
| 2/18/14 | 6.037 | 6.067 |
| 2/19/14 | 6.049 | 6.076 |
| 2/20/14 | 6.07 | 6.083 |
| 2/21/14 | 6.089 | 6.091 |
| 2/24/14 | 6.095 | 6.098 |
| 2/25/14 | 6.115 | 6.124 |
| 2/26/14 | 6.117 | 6.124 |
| 2/27/14 | 6.1 | 6.128 |
| 2/28/14 | 6.119 | 6.145 |
| 3/3/14 | 6.126 | 6.146 |
| 3/4/14 | 6.13 | 6.143 |
| 3/5/14 | 6.12 | 6.128 |
| 3/6/14 | 6.1 | 6.118 |
| 3/7/14 | 6.11 | 6.126 |
| 3/10/14 | 6.136 | 6.138 |
| 3/11/14 | 6.14 | 6.14 |
| 3/12/14 | 6.14 | 6.145 |
| 3/13/14 | 6.138 | 6.136 |
| 3/14/14 | 6.153 | 6.15 |
| 3/17/14 | 6.158 | 6.178 |
| 3/18/14 | 6.176 | 6.192 |
| 3/19/14 | 6.187 | 6.193 |
| 3/20/14 | 6.205 | 6.227 |
| 3/21/14 | 6.195 | 6.225 |
| 3/24/14 | 6.18 | 6.196 |
| 3/25/14 | 6.184 | 6.201 |
| 3/26/14 | 6.201 | 6.208 |
| 3/27/14 | 6.207 | 6.212 |
| 3/28/14 | 6.202 | 6.212 |
| 3/31/14 | 6.214 | 6.216 |
| 4/1/14 | 6.204 | 6.206 |
| 4/2/14 | 6.203 | 6.205 |
| 4/3/14 | 6.214 | 6.21 |
| 4/4/14 | 6.214 | 6.212 |
| 4/7/14 | 6.209 | 6.212 |
| 4/8/14 | 6.19 | 6.197 |
| 4/9/14 | 6.19 | 6.2 |
| 4/10/14 | 6.21 | 6.212 |
| 4/11/14 | 6.209 | 6.211 |
| 4/14/14 | 6.223 | 6.219 |
| 4/15/14 | 6.224 | 6.222 |
| 4/16/14 | 6.224 | 6.22 |
| 4/17/14 | 6.223 | 6.219 |
| 4/18/14 | 6.222 | 6.224 |
| 4/21/14 | 6.228 | 6.227 |
| 4/22/14 | 6.237 | 6.237 |
| 4/23/14 | 6.238 | 6.237 |
| 4/24/14 | 6.251 | 6.248 |
| 4/25/14 | 6.257 | 6.253 |
| 4/28/14 | 6.251 | 6.252 |
| 4/29/14 | 6.258 | 6.258 |
| 4/30/14 | 6.251 | 6.259 |
| 5/1/14 | 6.252 | 6.259 |
| 5/2/14 | 6.254 | 6.259 |
| 5/5/14 | 6.242 | 6.245 |
| 5/6/14 | 6.22 | 6.226 |
| 5/7/14 | 6.232 | 6.234 |
| 5/8/14 | 6.231 | 6.228 |
| 5/9/14 | 6.233 | 6.227 |
| 5/12/14 | 6.241 | 6.237 |
| 5/13/14 | 6.234 | 6.229 |
| 5/14/14 | 6.225 | 6.229 |
| 5/15/14 | 6.23 | 6.23 |
| 5/16/14 | 6.232 | 6.233 |
| 5/19/14 | 6.236 | 6.237 |
| 5/20/14 | 6.236 | 6.238 |
| 5/21/14 | 6.233 | 6.234 |
| 5/22/14 | 6.232 | 6.235 |
| 5/23/14 | 6.234 | 6.236 |
| 5/26/14 | 6.236 | 6.239 |
| 5/27/14 | 6.253 | 6.247 |
| 5/28/14 | 6.263 | 6.254 |
| 5/29/14 | 6.247 | 6.238 |
| 5/30/14 | 6.246 | 6.247 |
| 6/2/14 | 6.255 | 6.247 |
| 6/3/14 | 6.25 | 6.254 |
| 6/4/14 | 6.253 | 6.249 |
| 6/5/14 | 6.253 | 6.255 |
| 6/6/14 | 6.244 | 6.25 |
| 6/9/14 | 6.226 | 6.24 |
| 6/10/14 | 6.215 | 6.224 |
| 6/11/14 | 6.221 | 6.228 |
| 6/12/14 | 6.211 | 6.218 |
| 6/13/14 | 6.212 | 6.209 |
| 6/16/14 | 6.219 | 6.225 |
| 6/17/14 | 6.231 | 6.226 |
| 6/18/14 | 6.225 | 6.231 |
| 6/19/14 | 6.229 | 6.229 |
| 6/20/14 | 6.227 | 6.224 |
| 6/23/14 | 6.223 | 6.225 |
| 6/24/14 | 6.232 | 6.231 |
| 6/25/14 | 6.227 | 6.234 |
| 6/26/14 | 6.224 | 6.224 |
| 6/27/14 | 6.214 | 6.218 |
| 6/30/14 | 6.204 | 6.204 |
| 7/1/14 | 6.202 | 6.2 |
| 7/2/14 | 6.216 | 6.21 |
| 7/3/14 | 6.21 | 6.212 |
| 7/4/14 | 6.206 | 6.204 |
| 7/7/14 | 6.2 | 6.204 |
| 7/8/14 | 6.203 | 6.201 |
| 7/9/14 | 6.196 | 6.199 |
| 7/10/14 | 6.202 | 6.202 |
| 7/11/14 | 6.202 | 6.203 |
| 7/14/14 | 6.208 | 6.206 |
| 7/15/14 | 6.215 | 6.208 |
| 7/16/14 | 6.207 | 6.204 |
| 7/17/14 | 6.206 | 6.203 |
| 7/18/14 | 6.206 | 6.208 |
| 7/21/14 | 6.204 | 6.209 |
| 7/22/14 | 6.202 | 6.202 |
| 7/23/14 | 6.19 | 6.198 |
| 7/24/14 | 6.19 | 6.194 |
| 7/25/14 | 6.188 | 6.191 |
| 7/28/14 | 6.181 | 6.187 |
| 7/29/14 | 6.18 | 6.18 |
| 7/30/14 | 6.173 | 6.171 |
| 7/31/14 | 6.18 | 6.174 |
| 8/1/14 | 6.179 | 6.179 |
| 8/4/14 | 6.174 | 6.178 |
| 8/5/14 | 6.169 | 6.17 |
| 8/6/14 | 6.16 | 6.162 |
| 8/7/14 | 6.165 | 6.162 |
| 8/8/14 | 6.154 | 6.156 |
| 8/11/14 | 6.153 | 6.153 |
| 8/12/14 | 6.159 | 6.158 |
| 8/13/14 | 6.159 | 6.153 |
| 8/14/14 | 6.151 | 6.152 |
| 8/15/14 | 6.147 | 6.147 |
| 8/18/14 | 6.14 | 6.142 |
| 8/19/14 | 6.143 | 6.141 |
| 8/20/14 | 6.144 | 6.14 |
| 8/21/14 | 6.153 | 6.151 |
| 8/22/14 | 6.155 | 6.151 |
| 8/25/14 | 6.154 | 6.154 |
| 8/26/14 | 6.15 | 6.152 |
| 8/27/14 | 6.143 | 6.143 |
| 8/28/14 | 6.15 | 6.142 |
| 8/29/14 | 6.148 | 6.143 |
| 9/1/14 | 6.146 | 6.142 |
| 9/2/14 | 6.151 | 6.148 |
| 9/3/14 | 6.144 | 6.141 |
| 9/4/14 | 6.146 | 6.138 |
| 9/5/14 | 6.14 | 6.14 |
| 9/8/14 | 6.138 | 6.14 |
| 9/9/14 | 6.138 | 6.136 |
| 9/10/14 | 6.132 | 6.128 |
| 9/11/14 | 6.136 | 6.13 |
| 9/12/14 | 6.14 | 6.134 |
| 9/15/14 | 6.169 | 6.142 |
| 9/16/14 | 6.155 | 6.146 |
| 9/17/14 | 6.153 | 6.138 |
| 9/18/14 | 6.145 | 6.14 |
| 9/19/14 | 6.144 | 6.14 |
| 9/22/14 | 6.152 | 6.14 |
| 9/23/14 | 6.142 | 6.137 |
| 9/24/14 | 6.138 | 6.135 |
| 9/25/14 | 6.146 | 6.136 |
| 9/26/14 | 6.144 | 6.127 |
| 9/29/14 | 6.178 | 6.15 |
| 9/30/14 | 6.178 | 6.138 |